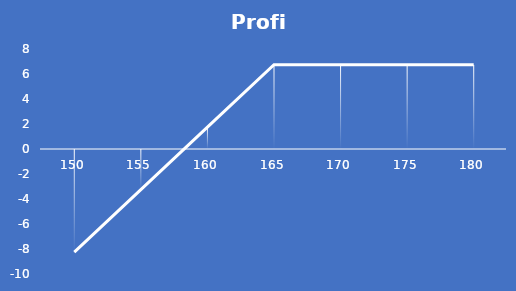
| Category | Profit |
|---|---|
| 150.0 | -8.25 |
| 155.0 | -3.25 |
| 160.0 | 1.75 |
| 165.0 | 6.75 |
| 170.0 | 6.75 |
| 175.0 | 6.75 |
| 180.0 | 6.75 |